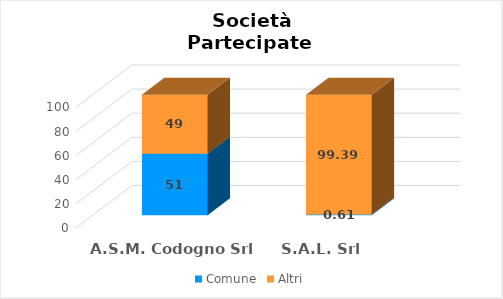
| Category | Comune | Altri |
|---|---|---|
| A.S.M. Codogno Srl | 51 | 49 |
| S.A.L. Srl | 0.61 | 99.39 |